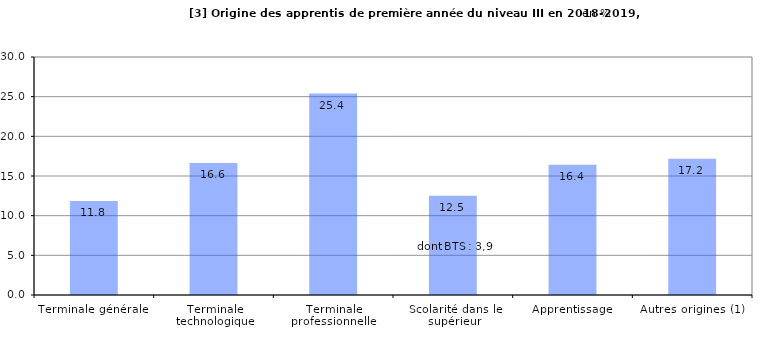
| Category | Series 0 |
|---|---|
| Terminale générale  | 11.85 |
| Terminale technologique | 16.646 |
| Terminale professionnelle  | 25.395 |
| Scolarité dans le supérieur | 12.525 |
| Apprentissage | 16.419 |
| Autres origines (1) | 17.166 |